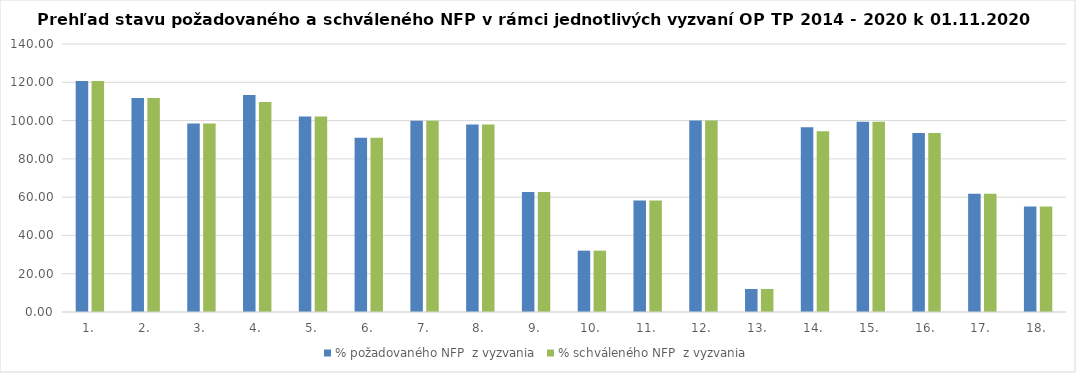
| Category | % požadovaného NFP  z vyzvania | % schváleného NFP  z vyzvania |
|---|---|---|
| 1. | 120.662 | 120.662 |
| 2. | 111.83 | 111.83 |
| 3. | 98.465 | 98.465 |
| 4. | 113.295 | 109.758 |
| 5. | 102.19 | 102.19 |
| 6. | 91.016 | 91.016 |
| 7. | 99.954 | 99.954 |
| 8. | 97.989 | 97.989 |
| 9. | 62.721 | 62.721 |
| 10. | 32.038 | 32.038 |
| 11. | 58.283 | 58.283 |
| 12. | 99.995 | 99.995 |
| 13. | 12.008 | 12.008 |
| 14. | 96.559 | 94.372 |
| 15. | 99.394 | 99.394 |
| 16. | 93.51 | 93.51 |
| 17. | 61.754 | 61.754 |
| 18. | 55.063 | 55.063 |